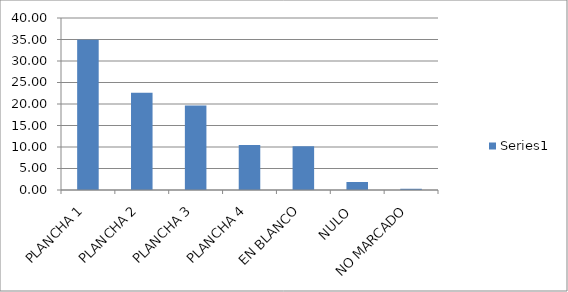
| Category | Series 0 |
|---|---|
| PLANCHA 1 | 34.957 |
| PLANCHA 2 | 22.636 |
| PLANCHA 3 | 19.628 |
| PLANCHA 4 | 10.458 |
| EN BLANCO | 10.172 |
| NULO  | 1.862 |
| NO MARCADO | 0.287 |